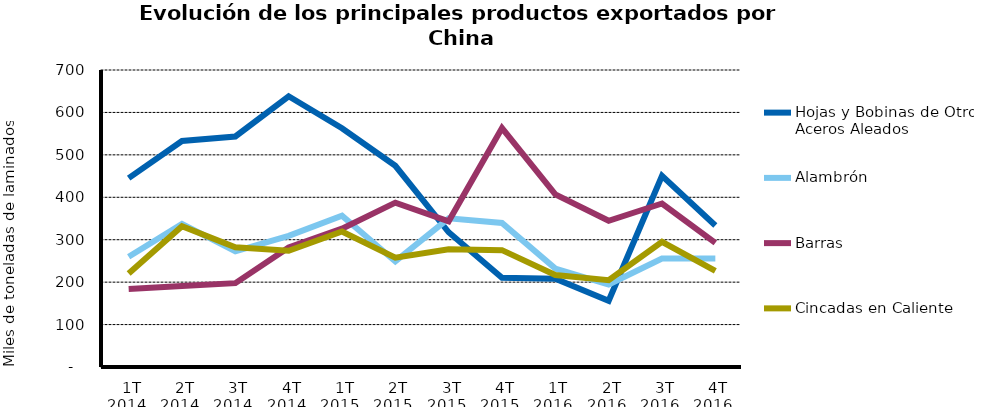
| Category | Hojas y Bobinas de Otros Aceros Aleados  | Alambrón | Barras  | Cincadas en Caliente |
|---|---|---|---|---|
| 1T 2014 | 445.195 | 259.848 | 183.862 | 220.44 |
| 2T 2014 | 532.651 | 337.404 | 190.658 | 331.939 |
| 3T 2014 | 543.357 | 272.686 | 197.608 | 282.084 |
| 4T 2014 | 638.009 | 309.2 | 281.756 | 273.933 |
| 1T 2015 | 562.631 | 356.386 | 326.054 | 319.484 |
| 2T 2015 | 474.134 | 248.754 | 387.311 | 257.545 |
| 3T 2015 | 317.539 | 350.277 | 343.313 | 277.45 |
| 4T 2015 | 210.455 | 339.37 | 563.164 | 275.398 |
| 1T 2016 | 208.036 | 231.957 | 406.937 | 216.791 |
| 2T 2016 | 156.096 | 194.428 | 344.665 | 204.653 |
| 3T 2016 | 450.493 | 255.627 | 385.307 | 294.974 |
| 4T 2016 | 333.367 | 255.678 | 292.429 | 226.686 |